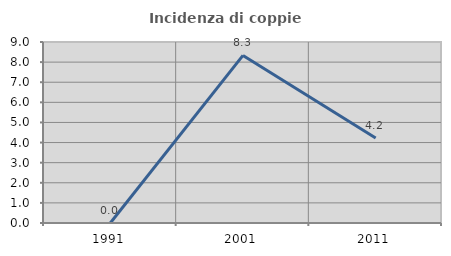
| Category | Incidenza di coppie miste |
|---|---|
| 1991.0 | 0 |
| 2001.0 | 8.333 |
| 2011.0 | 4.225 |